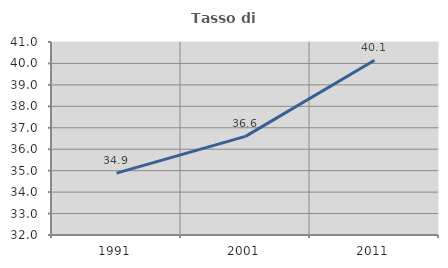
| Category | Tasso di occupazione   |
|---|---|
| 1991.0 | 34.886 |
| 2001.0 | 36.6 |
| 2011.0 | 40.147 |